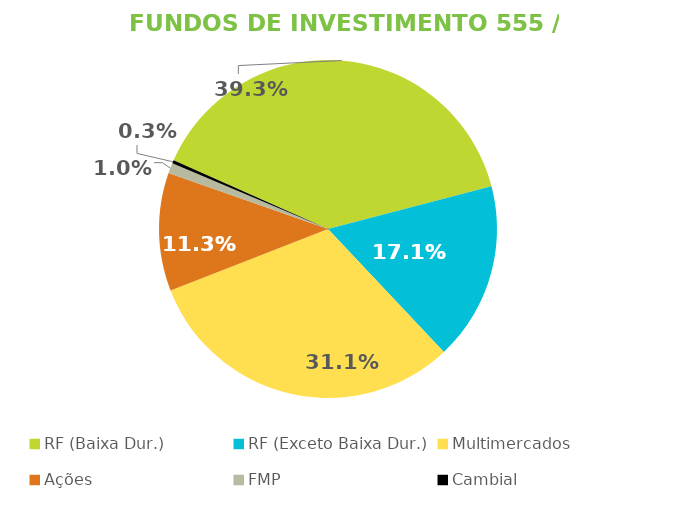
| Category | Fundos de Investimento 555 / FMP |
|---|---|
| RF (Baixa Dur.) | 0.393 |
| RF (Exceto Baixa Dur.) | 0.171 |
| Multimercados | 0.311 |
| Ações | 0.113 |
| FMP | 0.01 |
| Cambial | 0.003 |